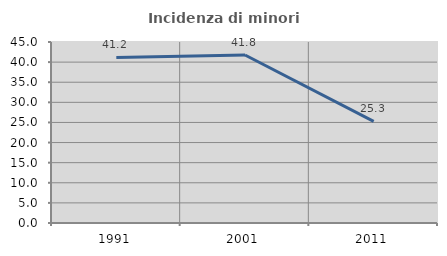
| Category | Incidenza di minori stranieri |
|---|---|
| 1991.0 | 41.176 |
| 2001.0 | 41.758 |
| 2011.0 | 25.258 |